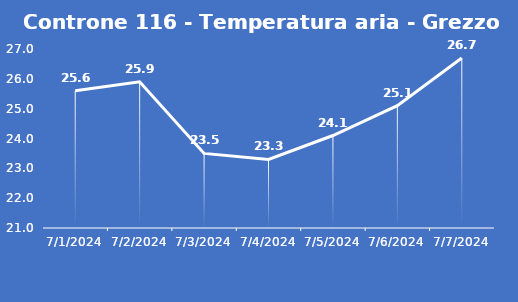
| Category | Controne 116 - Temperatura aria - Grezzo (°C) |
|---|---|
| 7/1/24 | 25.6 |
| 7/2/24 | 25.9 |
| 7/3/24 | 23.5 |
| 7/4/24 | 23.3 |
| 7/5/24 | 24.1 |
| 7/6/24 | 25.1 |
| 7/7/24 | 26.7 |